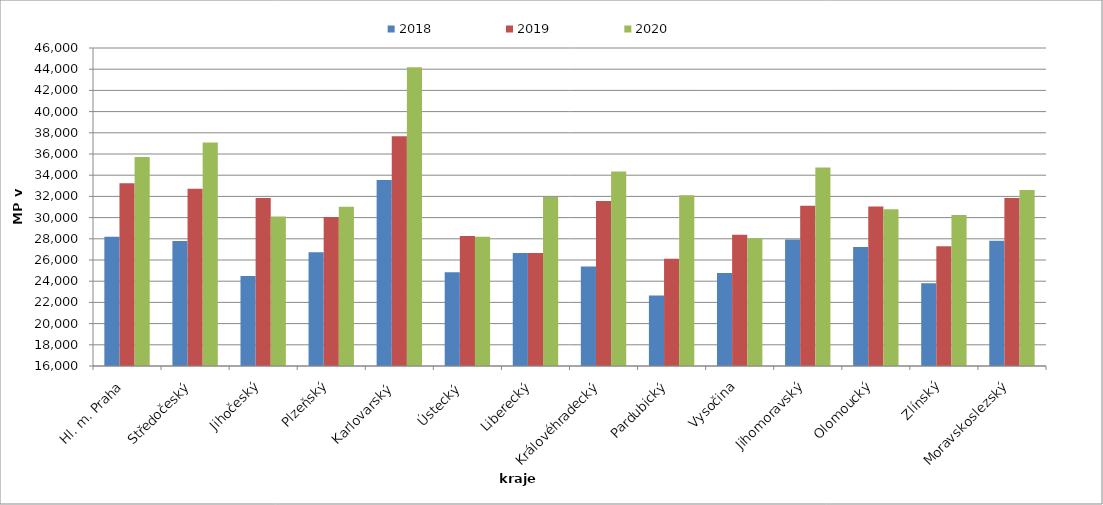
| Category | 2018 | 2019 | 2020 |
|---|---|---|---|
| Hl. m. Praha | 28192.063 | 33246.368 | 35705.939 |
| Středočeský | 27798.868 | 32723.951 | 37079.486 |
| Jihočeský | 24500.045 | 31845.899 | 30092.877 |
| Plzeňský | 26725.734 | 30049.401 | 31014.914 |
| Karlovarský  | 33547.126 | 37673.563 | 44180 |
| Ústecký   | 24842.496 | 28273.457 | 28191.097 |
| Liberecký | 26661.54 | 26661.54 | 31940.472 |
| Královéhradecký | 25384.501 | 31573.247 | 34349.428 |
| Pardubický | 22646.65 | 26127.025 | 32104.094 |
| Vysočina | 24784.784 | 28387.878 | 28060.688 |
| Jihomoravský | 27925.043 | 31106.801 | 34727.023 |
| Olomoucký | 27225.037 | 31053.994 | 30782.685 |
| Zlínský | 23794.914 | 27299.479 | 30246.178 |
| Moravskoslezský | 27805.268 | 31855.38 | 32599.61 |